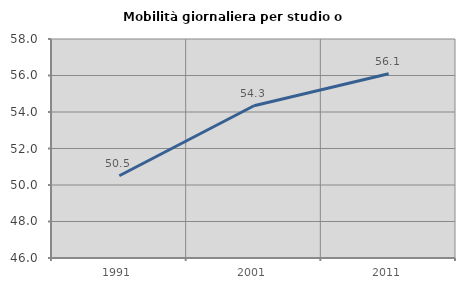
| Category | Mobilità giornaliera per studio o lavoro |
|---|---|
| 1991.0 | 50.507 |
| 2001.0 | 54.343 |
| 2011.0 | 56.095 |